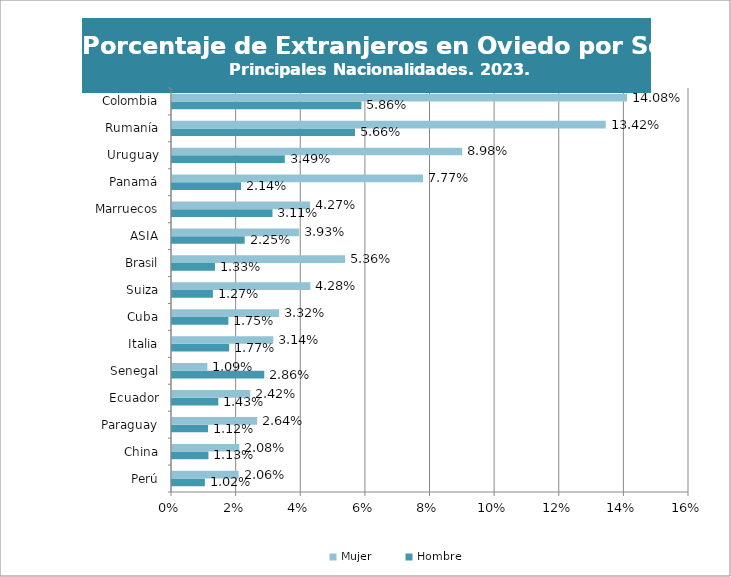
| Category | Hombre | Mujer |
|---|---|---|
| Perú | 0.01 | 0.021 |
| China | 0.011 | 0.021 |
| Paraguay | 0.011 | 0.026 |
| Ecuador | 0.014 | 0.024 |
| Senegal | 0.029 | 0.011 |
| Italia | 0.018 | 0.031 |
| Cuba | 0.017 | 0.033 |
| Suiza | 0.013 | 0.043 |
| Brasil | 0.013 | 0.054 |
| ASIA | 0.022 | 0.039 |
| Marruecos | 0.031 | 0.043 |
| Panamá | 0.021 | 0.078 |
| Uruguay | 0.035 | 0.09 |
| Rumanía | 0.057 | 0.134 |
| Colombia | 0.059 | 0.141 |